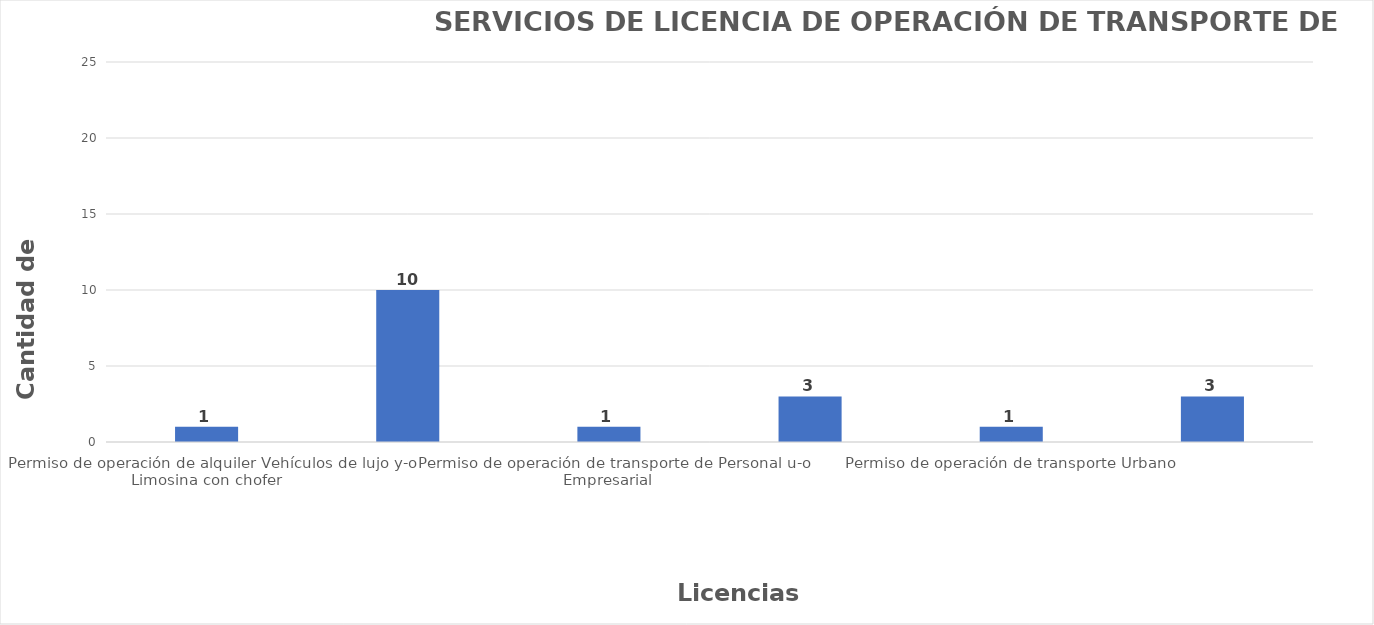
| Category | Series 0 |
|---|---|
| Permiso de operación de alquiler Vehículos de lujo y-o Limosina con chofer  | 1 |
| Permiso de operación de transporte Escolar (Escuelas Centros Educativos y Universidades)  | 10 |
| Permiso de operación de transporte de Personal u-o Empresarial  | 1 |
| Permiso de operación de transporte Turístico Terrestres de Autobuses y Minibuses Persona Física o Moral  | 3 |
| Permiso de operación de transporte Urbano  | 1 |
| Permiso de operación de Transporte Interurbano  | 3 |